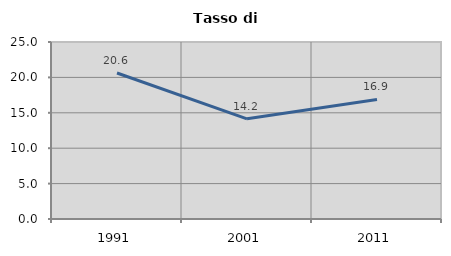
| Category | Tasso di disoccupazione   |
|---|---|
| 1991.0 | 20.623 |
| 2001.0 | 14.15 |
| 2011.0 | 16.891 |